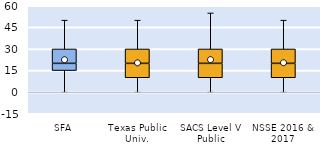
| Category | 25th | 50th | 75th |
|---|---|---|---|
| SFA | 15 | 5 | 10 |
| Texas Public Univ. | 10 | 10 | 10 |
| SACS Level V Public | 10 | 10 | 10 |
| NSSE 2016 & 2017 | 10 | 10 | 10 |